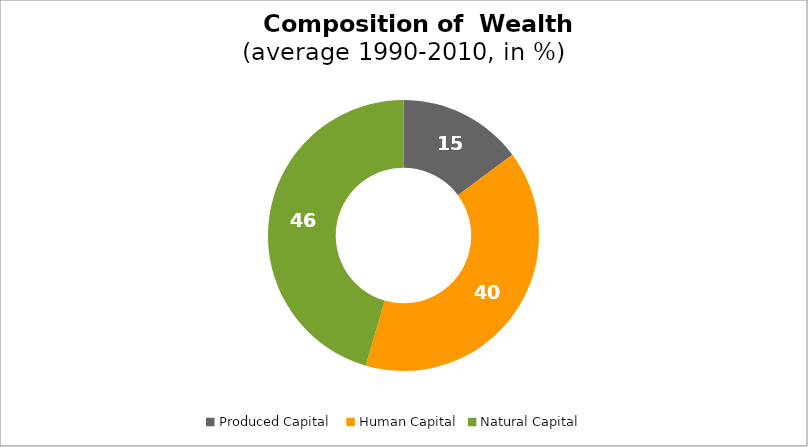
| Category | Series 0 |
|---|---|
| Produced Capital  | 14.852 |
| Human Capital | 39.644 |
| Natural Capital | 45.505 |